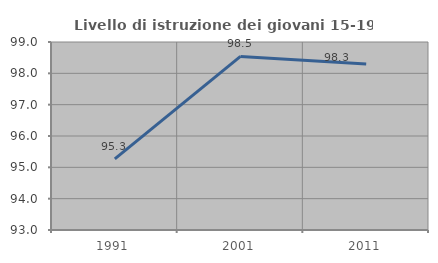
| Category | Livello di istruzione dei giovani 15-19 anni |
|---|---|
| 1991.0 | 95.272 |
| 2001.0 | 98.54 |
| 2011.0 | 98.295 |